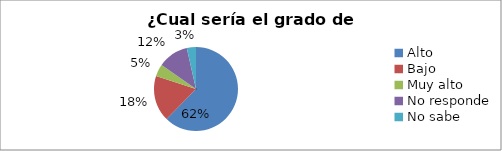
| Category | Series 0 |
|---|---|
| Alto | 0.624 |
| Bajo | 0.176 |
| Muy alto | 0.047 |
| No responde | 0.118 |
| No sabe | 0.035 |